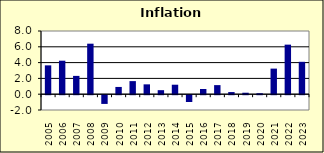
| Category | 2.6 |
|---|---|
| 2005.0 | 3.651 |
| 2006.0 | 4.24 |
| 2007.0 | 2.318 |
| 2008.0 | 6.394 |
| 2009.0 | -1.104 |
| 2010.0 | 0.918 |
| 2011.0 | 1.656 |
| 2012.0 | 1.247 |
| 2013.0 | 0.51 |
| 2014.0 | 1.201 |
| 2015.0 | -0.862 |
| 2016.0 | 0.661 |
| 2017.0 | 1.15 |
| 2018.0 | 0.27 |
| 2019.0 | 0.186 |
| 2020.0 | 0.122 |
| 2021.0 | 3.239 |
| 2022.0 | 6.274 |
| 2023.0 | 4.1 |